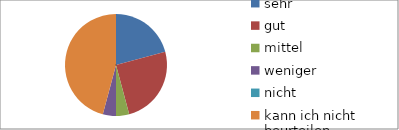
| Category | Series 0 |
|---|---|
| sehr | 5 |
| gut | 6 |
| mittel | 1 |
| weniger | 1 |
| nicht | 0 |
| kann ich nicht beurteilen | 11 |
| keine Angabe | 0 |